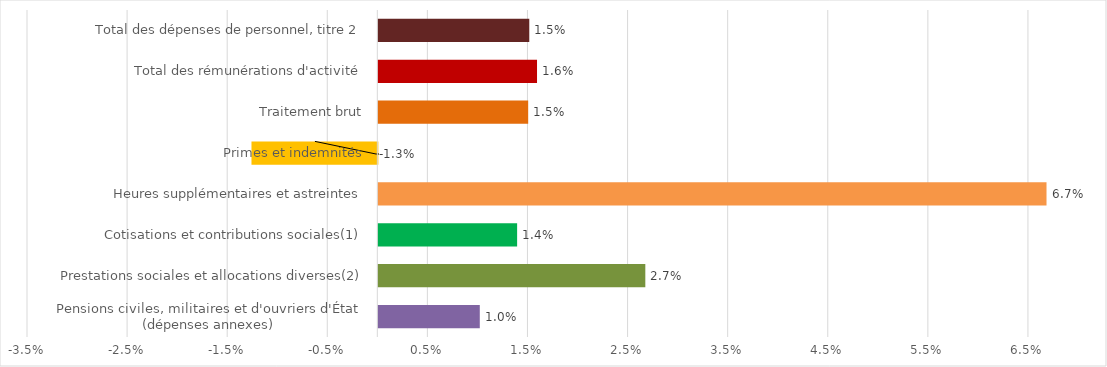
| Category | Évolution 2019/2018
(en %) |
|---|---|
| Pensions civiles, militaires et d'ouvriers d'État
(dépenses annexes) | 0.01 |
| Prestations sociales et allocations diverses(2) | 0.027 |
| Cotisations et contributions sociales(1) | 0.014 |
| Heures supplémentaires et astreintes | 0.067 |
| Primes et indemnités | -0.013 |
| Traitement brut | 0.015 |
| Total des rémunérations d'activité | 0.016 |
| Total des dépenses de personnel, titre 2 | 0.015 |